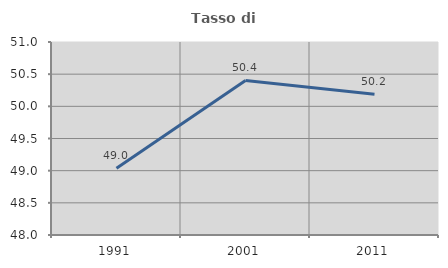
| Category | Tasso di occupazione   |
|---|---|
| 1991.0 | 49.036 |
| 2001.0 | 50.402 |
| 2011.0 | 50.188 |